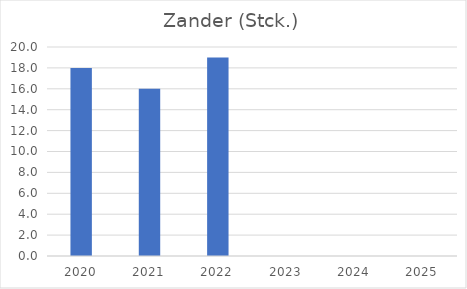
| Category | Zander (Stck.) |
|---|---|
| 2020.0 | 18 |
| 2021.0 | 16 |
| 2022.0 | 19 |
| 2023.0 | 0 |
| 2024.0 | 0 |
| 2025.0 | 0 |